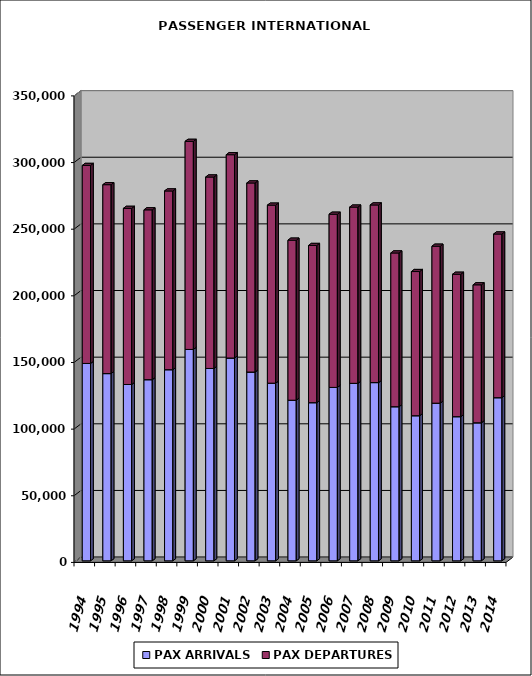
| Category | PAX ARRIVALS | PAX DEPARTURES |
|---|---|---|
| 1994.0 | 148086 | 148554 |
| 1995.0 | 140472 | 141720 |
| 1996.0 | 132294 | 132136 |
| 1997.0 | 135911 | 127423 |
| 1998.0 | 143404 | 134094 |
| 1999.0 | 158602 | 156102 |
| 2000.0 | 144322 | 143626 |
| 2001.0 | 152173 | 152513 |
| 2002.0 | 141649 | 141839 |
| 2003.0 | 133290 | 133545 |
| 2004.0 | 120502 | 120060 |
| 2005.0 | 118654 | 117939 |
| 2006.0 | 130101 | 129938 |
| 2007.0 | 133154 | 132228 |
| 2008.0 | 133718 | 133275 |
| 2009.0 | 115639 | 115329 |
| 2010.0 | 108882 | 108153 |
| 2011.0 | 118274 | 117774 |
| 2012.0 | 108151 | 106833 |
| 2013.0 | 103563 | 103513 |
| 2014.0 | 122392 | 122809 |